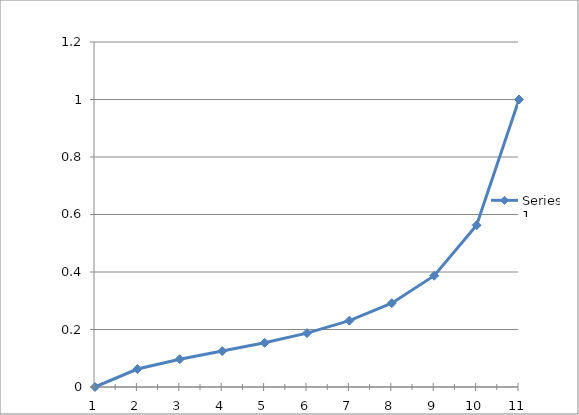
| Category | Series 0 |
|---|---|
| 0 | 0 |
| 1 | 0.062 |
| 2 | 0.097 |
| 3 | 0.125 |
| 4 | 0.154 |
| 5 | 0.188 |
| 6 | 0.231 |
| 7 | 0.292 |
| 8 | 0.387 |
| 9 | 0.562 |
| 10 | 1 |